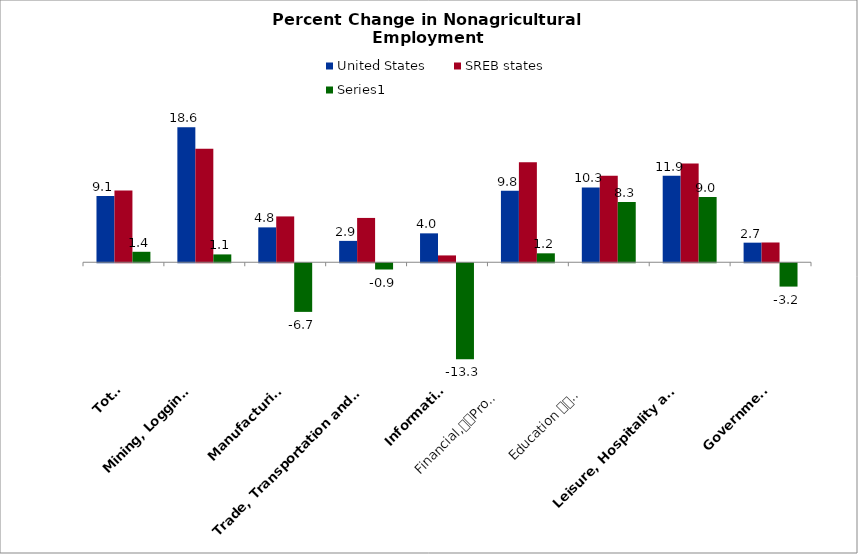
| Category | United States | SREB states | Series 0 |
|---|---|---|---|
| Total | 9.123 | 9.881 | 1.444 |
| Mining, Logging 
and Construction | 18.635 | 15.638 | 1.081 |
| Manufacturing | 4.81 | 6.321 | -6.708 |
| Trade, Transportation and Utilities | 2.948 | 6.113 | -0.862 |
| Information | 3.986 | 0.942 | -13.258 |
| Financial,
Professional and 
Business Services | 9.848 | 13.808 | 1.232 |
| Education 
and 
Health Services | 10.315 | 11.93 | 8.308 |
| Leisure, Hospitality and 
Other Services | 11.925 | 13.61 | 9.001 |
| Government | 2.702 | 2.726 | -3.22 |